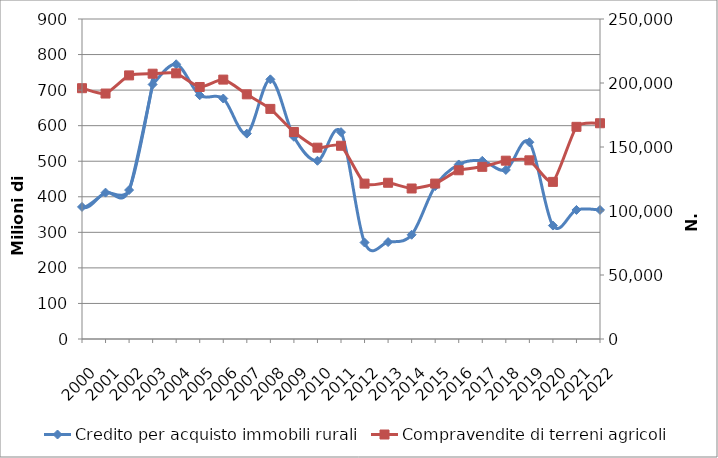
| Category | Credito per acquisto immobili rurali |
|---|---|
| 1997.0 | 227.255 |
| 1998.0 | 422.966 |
| 1999.0 | 487.537 |
| 2000.0 | 371.451 |
| 2001.0 | 411.695 |
| 2002.0 | 418.929 |
| 2003.0 | 715.871 |
| 2004.0 | 772.715 |
| 2005.0 | 685.49 |
| 2006.0 | 676.335 |
| 2007.0 | 577.622 |
| 2008.0 | 730.28 |
| 2009.0 | 568.73 |
| 2010.0 | 501.254 |
| 2011.0 | 581.716 |
| 2012.0 | 271.333 |
| 2013.0 | 272.554 |
| 2014.0 | 293.197 |
| 2015.0 | 429.843 |
| 2016.0 | 490.837 |
| 2017.0 | 501.162 |
| 2018.0 | 475.466 |
| 2019.0 | 553.438 |
| 2020.0 | 319.059 |
| 2021.0 | 362.94 |
| 2022.0 | 362.94 |